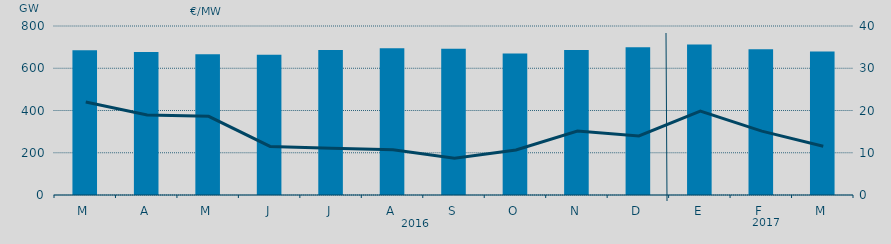
| Category | Energia (MWh) a subir |
|---|---|
| M | 685.406 |
| A | 677.215 |
| M | 666.328 |
| J | 664.292 |
| J | 686.788 |
| A | 694.56 |
| S | 691.889 |
| O | 669.591 |
| N | 686.044 |
| D | 698.836 |
| E | 712.52 |
| F | 690.067 |
| M | 679.79 |